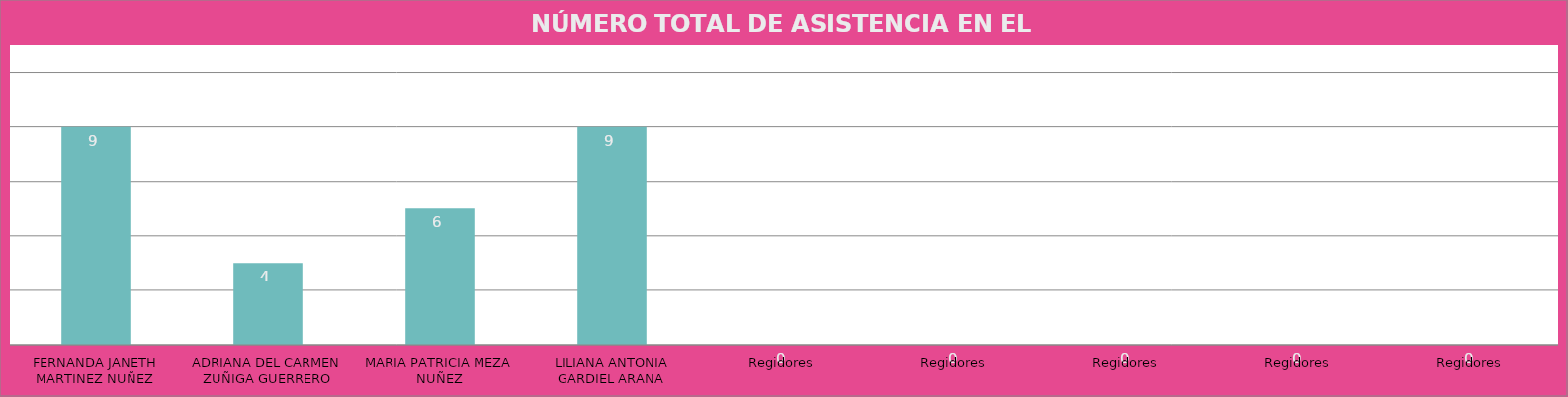
| Category | FERNANDA JANETH MARTINEZ NUÑEZ |
|---|---|
| FERNANDA JANETH MARTINEZ NUÑEZ | 9 |
| ADRIANA DEL CARMEN ZUÑIGA GUERRERO | 4 |
| MARIA PATRICIA MEZA NUÑEZ | 6 |
| LILIANA ANTONIA GARDIEL ARANA | 9 |
| Regidores | 0 |
| Regidores | 0 |
| Regidores | 0 |
| Regidores | 0 |
| Regidores | 0 |